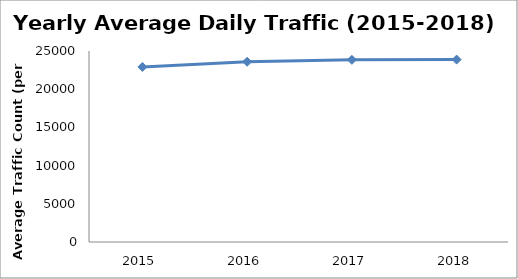
| Category | Series 0 |
|---|---|
| 2015.0 | 22915.57 |
| 2016.0 | 23594.139 |
| 2017.0 | 23845.814 |
| 2018.0 | 23873.688 |